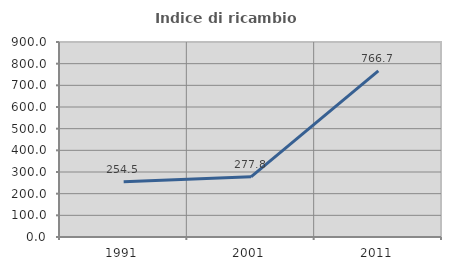
| Category | Indice di ricambio occupazionale  |
|---|---|
| 1991.0 | 254.545 |
| 2001.0 | 277.778 |
| 2011.0 | 766.667 |